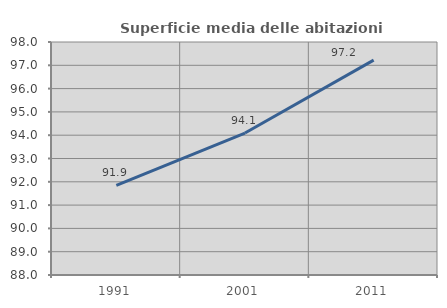
| Category | Superficie media delle abitazioni occupate |
|---|---|
| 1991.0 | 91.85 |
| 2001.0 | 94.093 |
| 2011.0 | 97.222 |